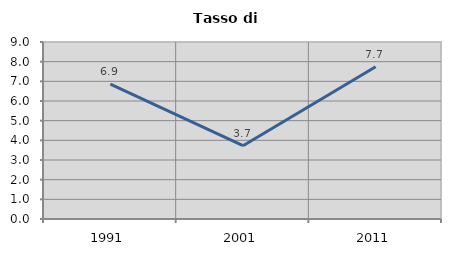
| Category | Tasso di disoccupazione   |
|---|---|
| 1991.0 | 6.853 |
| 2001.0 | 3.728 |
| 2011.0 | 7.739 |